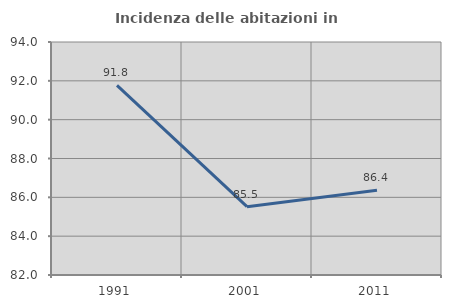
| Category | Incidenza delle abitazioni in proprietà  |
|---|---|
| 1991.0 | 91.768 |
| 2001.0 | 85.517 |
| 2011.0 | 86.364 |